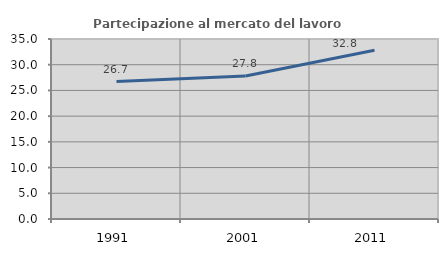
| Category | Partecipazione al mercato del lavoro  femminile |
|---|---|
| 1991.0 | 26.734 |
| 2001.0 | 27.813 |
| 2011.0 | 32.795 |